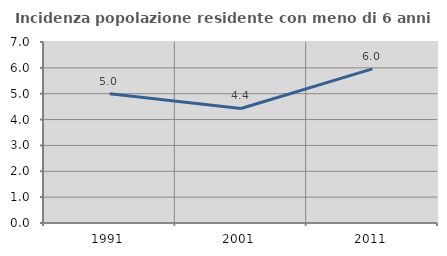
| Category | Incidenza popolazione residente con meno di 6 anni |
|---|---|
| 1991.0 | 5 |
| 2001.0 | 4.429 |
| 2011.0 | 5.963 |